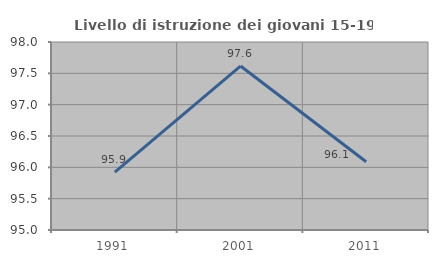
| Category | Livello di istruzione dei giovani 15-19 anni |
|---|---|
| 1991.0 | 95.923 |
| 2001.0 | 97.617 |
| 2011.0 | 96.088 |